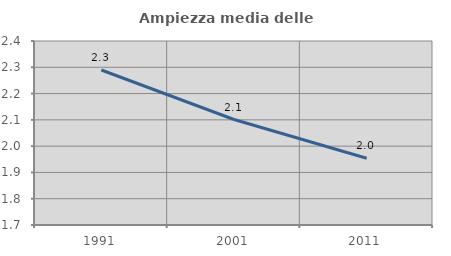
| Category | Ampiezza media delle famiglie |
|---|---|
| 1991.0 | 2.29 |
| 2001.0 | 2.101 |
| 2011.0 | 1.954 |